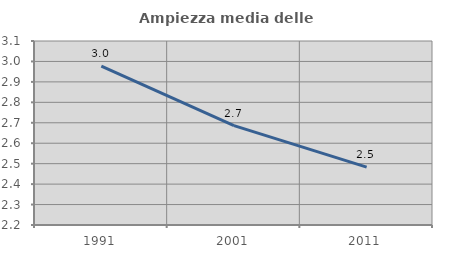
| Category | Ampiezza media delle famiglie |
|---|---|
| 1991.0 | 2.978 |
| 2001.0 | 2.686 |
| 2011.0 | 2.483 |